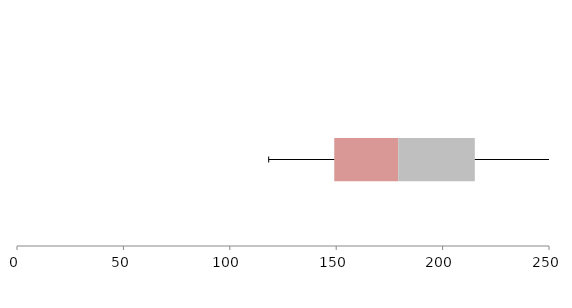
| Category | Series 1 | Series 2 | Series 3 |
|---|---|---|---|
| 0 | 149.088 | 30.066 | 35.989 |